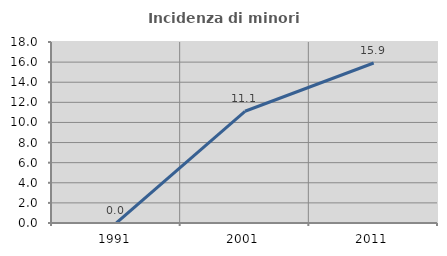
| Category | Incidenza di minori stranieri |
|---|---|
| 1991.0 | 0 |
| 2001.0 | 11.111 |
| 2011.0 | 15.909 |